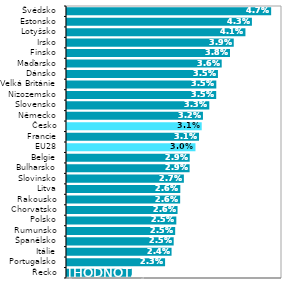
| Category | Series 0 |
|---|---|
| Řecko | 0.015 |
| Portugalsko | 0.023 |
| Itálie | 0.024 |
| Španělsko | 0.025 |
| Rumunsko | 0.025 |
| Polsko | 0.025 |
| Chorvatsko | 0.026 |
| Rakousko | 0.026 |
| Litva | 0.026 |
| Slovinsko | 0.027 |
| Bulharsko | 0.029 |
| Belgie | 0.029 |
| EU28 | 0.03 |
| Francie | 0.031 |
| Česko | 0.031 |
| Německo | 0.032 |
| Slovensko | 0.033 |
| Nizozemsko | 0.035 |
| Velká Británie | 0.035 |
| Dánsko | 0.035 |
| Maďarsko | 0.036 |
| Finsko | 0.038 |
| Irsko | 0.039 |
| Lotyšsko | 0.041 |
| Estonsko | 0.043 |
| Švédsko | 0.047 |